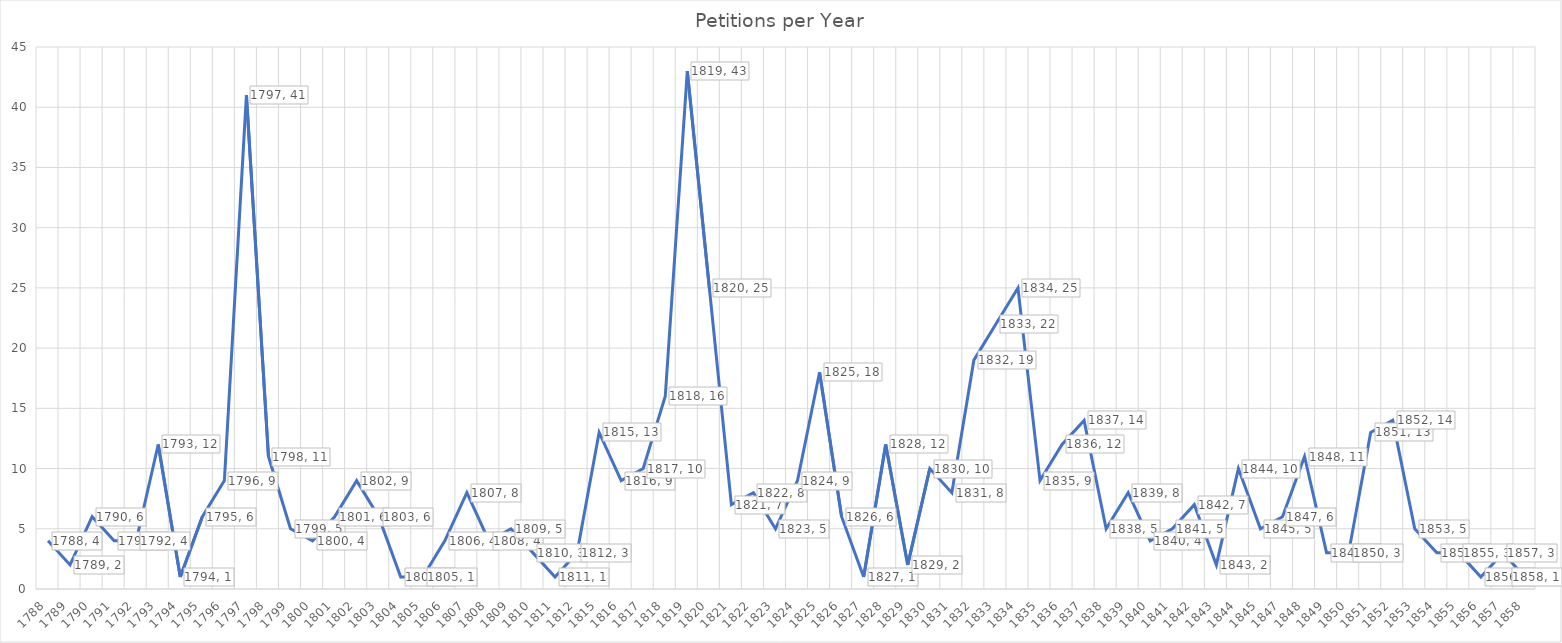
| Category | Count |
|---|---|
| 1788.0 | 4 |
| 1789.0 | 2 |
| 1790.0 | 6 |
| 1791.0 | 4 |
| 1792.0 | 4 |
| 1793.0 | 12 |
| 1794.0 | 1 |
| 1795.0 | 6 |
| 1796.0 | 9 |
| 1797.0 | 41 |
| 1798.0 | 11 |
| 1799.0 | 5 |
| 1800.0 | 4 |
| 1801.0 | 6 |
| 1802.0 | 9 |
| 1803.0 | 6 |
| 1804.0 | 1 |
| 1805.0 | 1 |
| 1806.0 | 4 |
| 1807.0 | 8 |
| 1808.0 | 4 |
| 1809.0 | 5 |
| 1810.0 | 3 |
| 1811.0 | 1 |
| 1812.0 | 3 |
| 1815.0 | 13 |
| 1816.0 | 9 |
| 1817.0 | 10 |
| 1818.0 | 16 |
| 1819.0 | 43 |
| 1820.0 | 25 |
| 1821.0 | 7 |
| 1822.0 | 8 |
| 1823.0 | 5 |
| 1824.0 | 9 |
| 1825.0 | 18 |
| 1826.0 | 6 |
| 1827.0 | 1 |
| 1828.0 | 12 |
| 1829.0 | 2 |
| 1830.0 | 10 |
| 1831.0 | 8 |
| 1832.0 | 19 |
| 1833.0 | 22 |
| 1834.0 | 25 |
| 1835.0 | 9 |
| 1836.0 | 12 |
| 1837.0 | 14 |
| 1838.0 | 5 |
| 1839.0 | 8 |
| 1840.0 | 4 |
| 1841.0 | 5 |
| 1842.0 | 7 |
| 1843.0 | 2 |
| 1844.0 | 10 |
| 1845.0 | 5 |
| 1847.0 | 6 |
| 1848.0 | 11 |
| 1849.0 | 3 |
| 1850.0 | 3 |
| 1851.0 | 13 |
| 1852.0 | 14 |
| 1853.0 | 5 |
| 1854.0 | 3 |
| 1855.0 | 3 |
| 1856.0 | 1 |
| 1857.0 | 3 |
| 1858.0 | 1 |